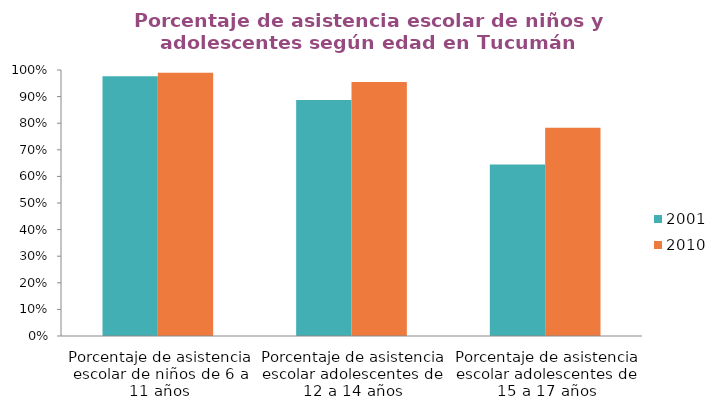
| Category | 2001 | 2010 |
|---|---|---|
| Porcentaje de asistencia escolar de niños de 6 a 11 años | 0.976 | 0.99 |
| Porcentaje de asistencia escolar adolescentes de 12 a 14 años | 0.888 | 0.955 |
| Porcentaje de asistencia escolar adolescentes de 15 a 17 años | 0.645 | 0.783 |